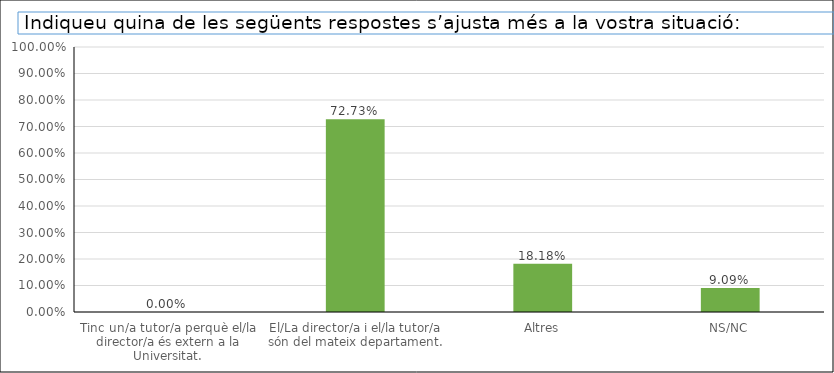
| Category | Series 0 |
|---|---|
| Tinc un/a tutor/a perquè el/la director/a és extern a la Universitat. | 0 |
| El/La director/a i el/la tutor/a són del mateix departament. | 0.727 |
| Altres | 0.182 |
| NS/NC | 0.091 |